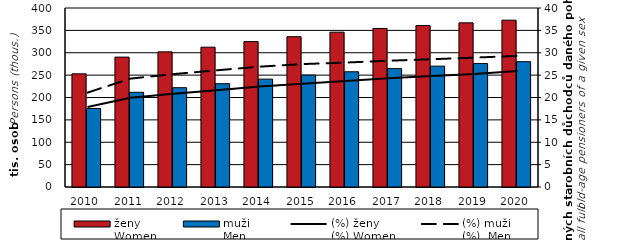
| Category | ženy  
Women | muži  
Men |
|---|---|---|
| 2010.0 | 252859 | 175536 |
| 2011.0 | 290224 | 211565 |
| 2012.0 | 301986 | 221900 |
| 2013.0 | 312495 | 230861 |
| 2014.0 | 324865 | 241061 |
| 2015.0 | 335915 | 250094 |
| 2016.0 | 346027 | 257474 |
| 2017.0 | 354331 | 264511 |
| 2018.0 | 360801 | 270095 |
| 2019.0 | 366846 | 275790 |
| 2020.0 | 372810 | 280034 |